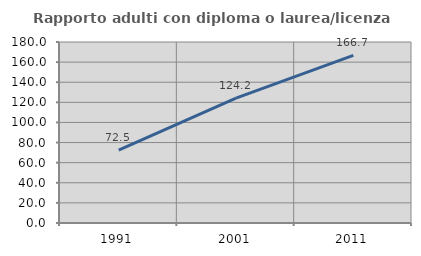
| Category | Rapporto adulti con diploma o laurea/licenza media  |
|---|---|
| 1991.0 | 72.479 |
| 2001.0 | 124.213 |
| 2011.0 | 166.667 |